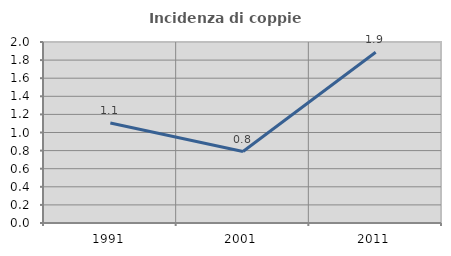
| Category | Incidenza di coppie miste |
|---|---|
| 1991.0 | 1.105 |
| 2001.0 | 0.789 |
| 2011.0 | 1.887 |